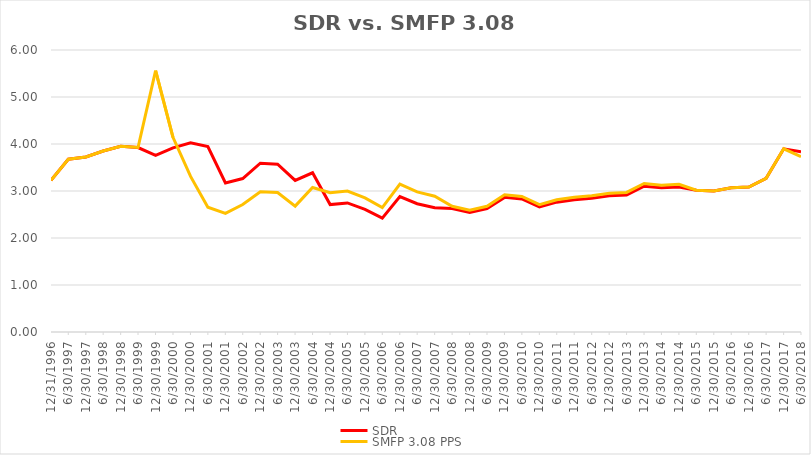
| Category | SDR | SMFP 3.08 PPS |
|---|---|---|
| 12/31/96 | 3.225 | 3.225 |
| 6/30/97 | 3.675 | 3.675 |
| 12/31/97 | 3.725 | 3.725 |
| 6/30/98 | 3.85 | 3.85 |
| 12/31/98 | 3.95 | 3.95 |
| 6/30/99 | 3.925 | 3.925 |
| 12/31/99 | 3.757 | 5.56 |
| 6/30/00 | 3.919 | 4.143 |
| 12/31/00 | 4.027 | 3.311 |
| 6/30/01 | 3.946 | 2.655 |
| 12/31/01 | 3.17 | 2.525 |
| 6/30/02 | 3.265 | 2.712 |
| 12/31/02 | 3.592 | 2.983 |
| 6/30/03 | 3.571 | 2.966 |
| 12/31/03 | 3.224 | 2.678 |
| 6/30/04 | 3.388 | 3.074 |
| 12/31/04 | 2.712 | 2.963 |
| 6/30/05 | 2.746 | 3 |
| 12/31/05 | 2.61 | 2.852 |
| 6/30/06 | 2.424 | 2.648 |
| 12/31/06 | 2.881 | 3.148 |
| 6/30/07 | 2.729 | 2.981 |
| 12/31/07 | 2.644 | 2.889 |
| 6/30/08 | 2.627 | 2.676 |
| 12/31/08 | 2.542 | 2.59 |
| 6/30/09 | 2.627 | 2.676 |
| 12/31/09 | 2.864 | 2.918 |
| 6/30/10 | 2.831 | 2.883 |
| 12/31/10 | 2.661 | 2.711 |
| 6/30/11 | 2.763 | 2.814 |
| 12/31/11 | 2.814 | 2.866 |
| 6/30/12 | 2.847 | 2.901 |
| 12/31/12 | 2.898 | 2.952 |
| 6/30/13 | 2.915 | 2.97 |
| 12/31/13 | 3.102 | 3.16 |
| 6/30/14 | 3.068 | 3.125 |
| 12/31/14 | 3.085 | 3.142 |
| 6/30/15 | 3.017 | 3.017 |
| 12/31/15 | 3 | 3 |
| 6/30/16 | 3.068 | 3.068 |
| 12/31/16 | 3.085 | 3.085 |
| 6/30/17 | 3.271 | 3.271 |
| 12/31/17 | 3.898 | 3.898 |
| 6/30/18 | 3.837 | 3.729 |